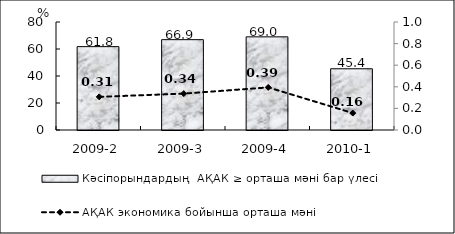
| Category | Кәсіпорындардың  АҚАК ≥ орташа мәні бар үлесі  |
|---|---|
| 2009-2 | 61.75 |
| 2009-3 | 66.92 |
| 2009-4 | 69 |
| 2010-1 | 45.35 |